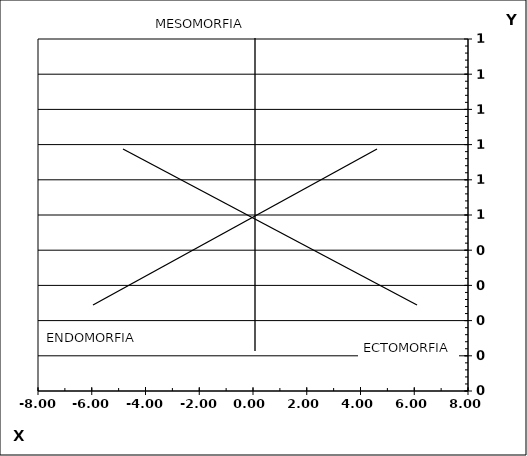
| Category | Series 1 |
|---|---|
| 0.0 | 0 |